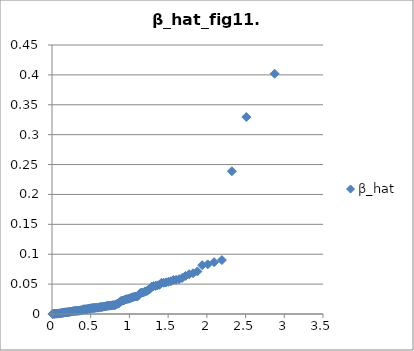
| Category | β_hat |
|---|---|
| 1.2218239922212495 | 0.038 |
| 0.8005588232868396 | 0.015 |
| 1.6032885295156099 | 0.057 |
| 2.8756270704708156 | 0.402 |
| 0.6681587582462173 | 0.012 |
| 1.3873909580680261 | 0.049 |
| 1.5021262136956048 | 0.054 |
| 2.0936595062951366 | 0.087 |
| 0.7730105634359591 | 0.014 |
| 1.3120118715480227 | 0.047 |
| 0.9647352806217081 | 0.025 |
| 0.759454628919302 | 0.014 |
| 1.0662949700359918 | 0.029 |
| 0.5821229449682337 | 0.011 |
| 0.30272850297153525 | 0.005 |
| 2.509308629165207 | 0.33 |
| 2.1941335988905526 | 0.09 |
| 1.0312590526267622 | 0.027 |
| 0.8145628535240322 | 0.015 |
| 0.47741797615372 | 0.009 |
| 1.140609990188963 | 0.035 |
| 0.4215039920015504 | 0.008 |
| 1.2884750596291885 | 0.046 |
| 0.6555763069587857 | 0.012 |
| 0.12668016120095024 | 0.002 |
| 0.05561920941611599 | 0.001 |
| 2.3233326278321016 | 0.239 |
| 0.8430623957630117 | 0.017 |
| 1.0486161089710224 | 0.028 |
| 1.243429303818069 | 0.04 |
| 1.0142072477285224 | 0.027 |
| 1.2007744390034392 | 0.038 |
| 0.6808478929329188 | 0.013 |
| 1.4143537431646485 | 0.052 |
| 1.3362988480226936 | 0.047 |
| 0.7327520403527368 | 0.014 |
| 2.0107219073844607 | 0.083 |
| 1.7706861719455724 | 0.066 |
| 1.102691198390971 | 0.029 |
| 1.640956469625396 | 0.058 |
| 1.1214490340650125 | 0.032 |
| 1.2656311697916718 | 0.042 |
| 0.1880895515037049 | 0.003 |
| 1.442385867763244 | 0.052 |
| 1.7241685529776052 | 0.064 |
| 1.681108016975268 | 0.06 |
| 1.180243894047243 | 0.036 |
| 0.6307166560478383 | 0.012 |
| 0.7195953213025243 | 0.014 |
| 1.0843135342087662 | 0.029 |
| 1.5677671502423158 | 0.057 |
| 1.5341205443525465 | 0.055 |
| 0.9022285270031009 | 0.022 |
| 1.3614006944748038 | 0.048 |
| 0.1778115609114148 | 0.003 |
| 0.13687571817608066 | 0.002 |
| 1.8213847801230927 | 0.068 |
| 1.8772497561695543 | 0.071 |
| 0.9974453519485859 | 0.026 |
| 1.1601991280091581 | 0.036 |
| 1.471599605176274 | 0.053 |
| 0.37771118039484214 | 0.006 |
| 0.4887764111146694 | 0.009 |
| 1.9396737242152815 | 0.082 |
| 0.28163186189022293 | 0.005 |
| 0.6936476143407155 | 0.013 |
| 0.9330261795058971 | 0.023 |
| 0.4104830799667825 | 0.008 |
| 0.7460368396059255 | 0.014 |
| 0.60624083731514 | 0.011 |
| 0.7065620015853495 | 0.014 |
| 0.9175185676579484 | 0.022 |
| 0.643096800705343 | 0.012 |
| 0.5941386906564383 | 0.011 |
| 0.04549886768839762 | 0.001 |
| 0.9487614835114762 | 0.024 |
| 0.09616806108819838 | 0.001 |
| 0.980959116141547 | 0.025 |
| 0.8287284831922679 | 0.016 |
| 0.5232411457338848 | 0.01 |
| 0.22941241575217935 | 0.004 |
| 0.0050537075493949975 | 0 |
| 0.2190476839032269 | 0.003 |
| 0.5116857401053212 | 0.01 |
| 0.06574525109109347 | 0.001 |
| 0.33463130666631574 | 0.005 |
| 0.8722637360623874 | 0.019 |
| 0.11649775590707183 | 0.002 |
| 0.0758780387328182 | 0.001 |
| 0.2606598399382271 | 0.004 |
| 0.25021723844214694 | 0.004 |
| 0.4661208047165216 | 0.009 |
| 0.4548828128354641 | 0.008 |
| 0.08601862322498113 | 0.001 |
| 0.5001982593717079 | 0.01 |
| 0.03538318398905752 | 0 |
| 0.1573106846101707 | 0.003 |
| 0.3668784624405738 | 0.006 |
| 0.5465652922487938 | 0.01 |
| 0.85757165505207 | 0.017 |
| 0.7867100613480268 | 0.015 |
| 0.16755232004858078 | 0.003 |
| 0.3133269750401387 | 0.005 |
| 0.2398018522610058 | 0.004 |
| 0.2711309442297125 | 0.005 |
| 0.015161638973700734 | 0 |
| 0.8871465590188761 | 0.021 |
| 0.20870643116868118 | 0.003 |
| 0.3560886277375486 | 0.006 |
| 0.14708552355463042 | 0.002 |
| 0.34534009163542995 | 0.005 |
| 0.5348668459879236 | 0.01 |
| 0.19838745034826696 | 0.003 |
| 0.025271119743895117 | 0 |
| 0.3239607606754233 | 0.005 |
| 0.5701906646300992 | 0.011 |
| 0.39951180245610823 | 0.008 |
| 0.4437019789539003 | 0.008 |
| 0.5583390221735804 | 0.01 |
| 0.6184324351820278 | 0.012 |
| 0.38858840539712125 | 0.006 |
| 0.4325763407267638 | 0.008 |
| 0.29216392789290946 | 0.005 |
| 0.1063274152633511 | 0.001 |